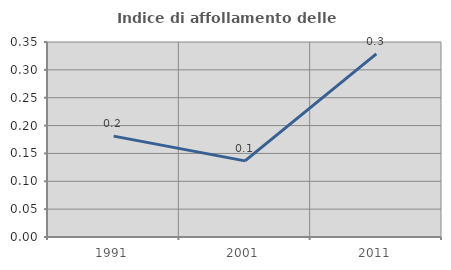
| Category | Indice di affollamento delle abitazioni  |
|---|---|
| 1991.0 | 0.181 |
| 2001.0 | 0.137 |
| 2011.0 | 0.329 |